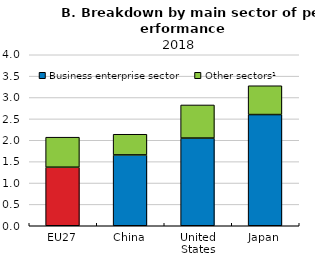
| Category | Business enterprise sector | Other sectors¹ |
|---|---|---|
| EU27 | 1.37 | 0.702 |
| China | 1.657 | 0.483 |
| United States | 2.051 | 0.775 |
| Japan | 2.601 | 0.674 |